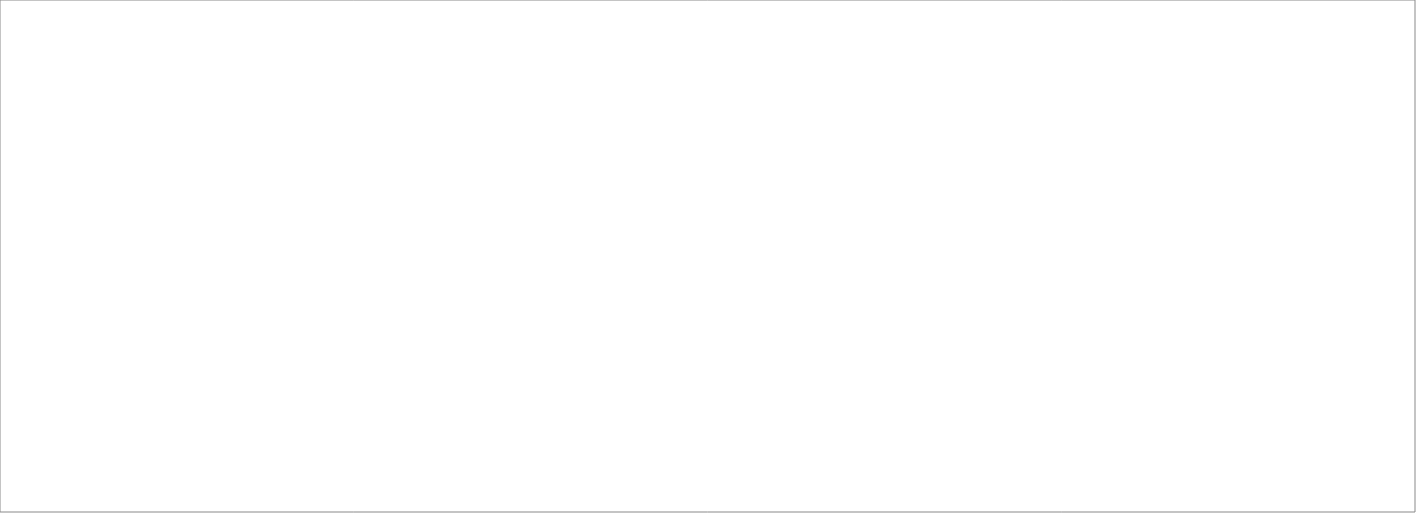
| Category | Total |
|---|---|
| Assessio Sverige AB | 100 |
| Talogy Sweden AB | 76.7 |
| Randstad AB | 70 |
| OnePartner Group AB | 70 |
| Pro Astri AB | 70 |